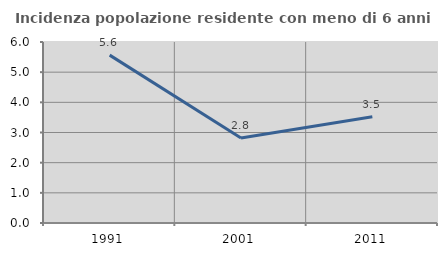
| Category | Incidenza popolazione residente con meno di 6 anni |
|---|---|
| 1991.0 | 5.564 |
| 2001.0 | 2.818 |
| 2011.0 | 3.521 |